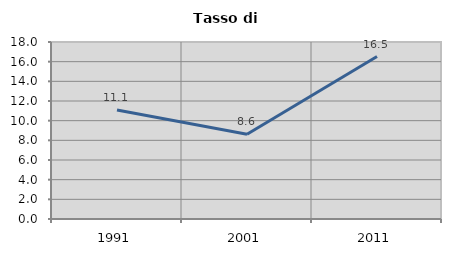
| Category | Tasso di disoccupazione   |
|---|---|
| 1991.0 | 11.081 |
| 2001.0 | 8.621 |
| 2011.0 | 16.522 |